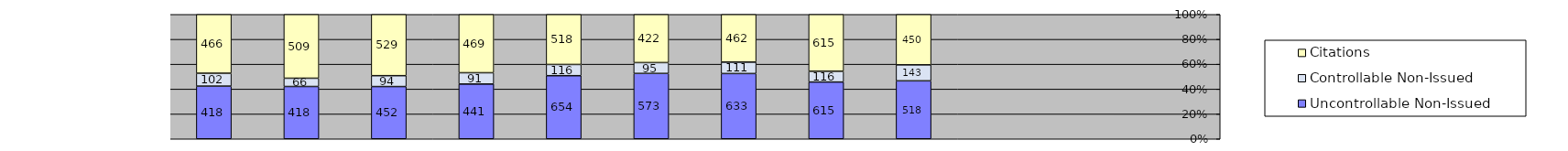
| Category | Uncontrollable Non-Issued | Controllable Non-Issued | Citations |
|---|---|---|---|
| 0 | 418 | 102 | 466 |
| 1900-01-01 | 418 | 66 | 509 |
| 1900-01-02 | 452 | 94 | 529 |
| 1900-01-03 | 441 | 91 | 469 |
| 1900-01-04 | 654 | 116 | 518 |
| 1900-01-05 | 573 | 95 | 422 |
| 1900-01-06 | 633 | 111 | 462 |
| 1900-01-07 | 615 | 116 | 615 |
| 1900-01-08 | 518 | 143 | 450 |
| 1900-01-09 | 0 | 0 | 0 |
| 1900-01-10 | 0 | 0 | 0 |
| 1900-01-11 | 0 | 0 | 0 |